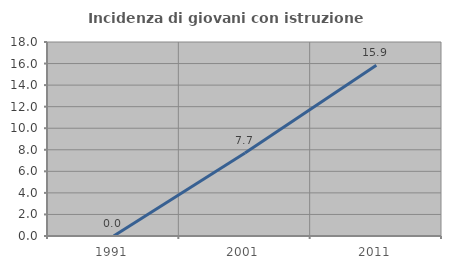
| Category | Incidenza di giovani con istruzione universitaria |
|---|---|
| 1991.0 | 0 |
| 2001.0 | 7.692 |
| 2011.0 | 15.854 |